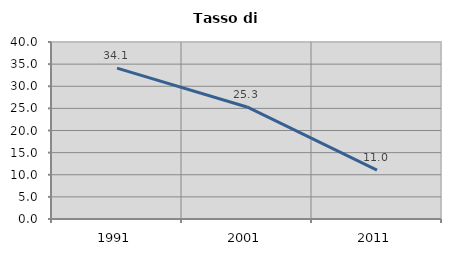
| Category | Tasso di disoccupazione   |
|---|---|
| 1991.0 | 34.105 |
| 2001.0 | 25.323 |
| 2011.0 | 11.036 |